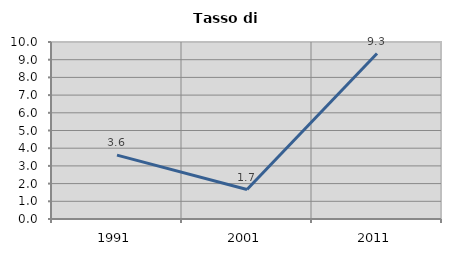
| Category | Tasso di disoccupazione   |
|---|---|
| 1991.0 | 3.607 |
| 2001.0 | 1.667 |
| 2011.0 | 9.346 |